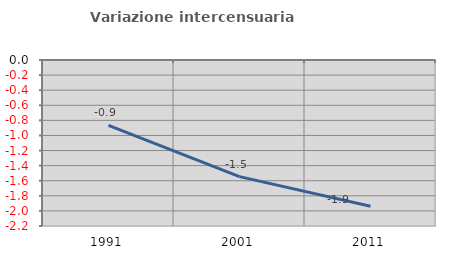
| Category | Variazione intercensuaria annua |
|---|---|
| 1991.0 | -0.867 |
| 2001.0 | -1.545 |
| 2011.0 | -1.937 |